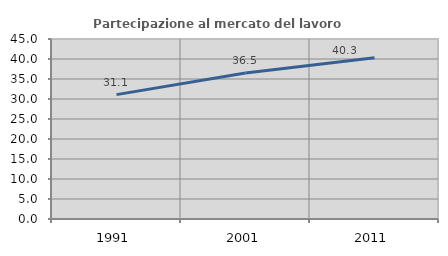
| Category | Partecipazione al mercato del lavoro  femminile |
|---|---|
| 1991.0 | 31.094 |
| 2001.0 | 36.505 |
| 2011.0 | 40.291 |